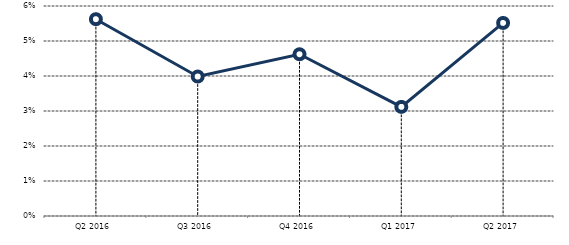
| Category | Series 0 |
|---|---|
| Q2 2016 | 0.056 |
| Q3 2016 | 0.04 |
| Q4 2016 | 0.046 |
| Q1 2017 | 0.031 |
| Q2 2017 | 0.055 |